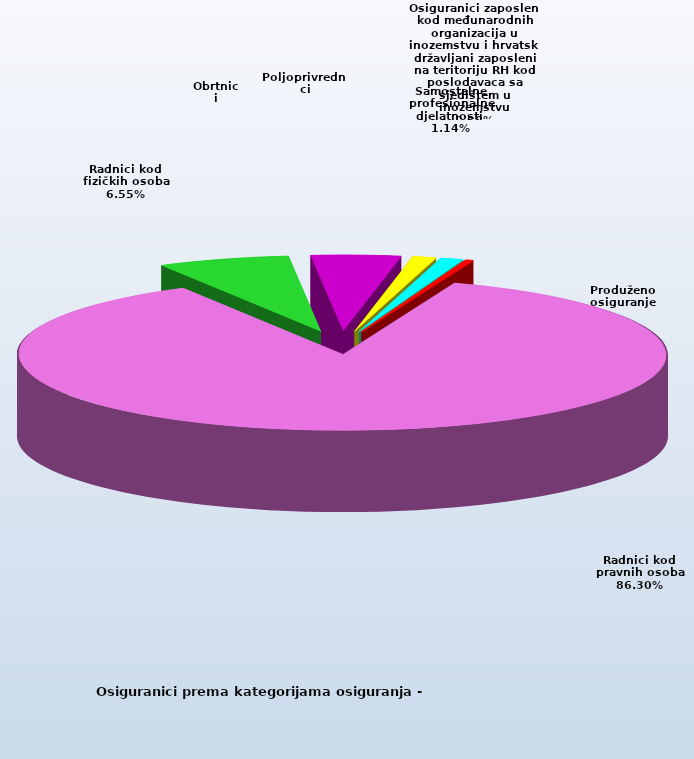
| Category | Series 0 |
|---|---|
| Radnici kod pravnih osoba | 1366253 |
| Radnici kod fizičkih osoba | 103748 |
| Obrtnici | 70474 |
| Poljoprivrednici | 18632 |
| Samostalne profesionalne djelatnosti  | 18110 |
| Osiguranici zaposleni kod međunarodnih organizacija u inozemstvu i hrvatski državljani zaposleni na teritoriju RH kod poslodavaca sa sjedištem u inozemstvu | 64 |
| Produženo osiguranje | 5850 |